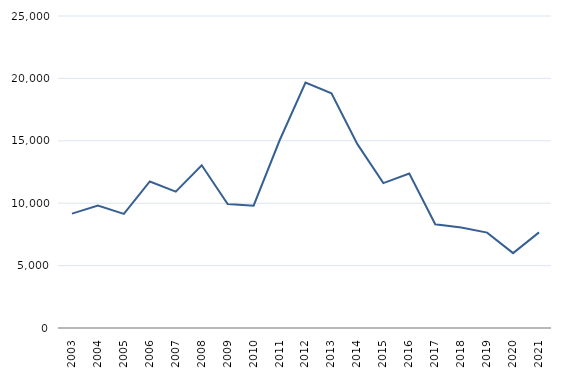
| Category | N |
|---|---|
| 2003.0 | 9165 |
| 2004.0 | 9807 |
| 2005.0 | 9146 |
| 2006.0 | 11742 |
| 2007.0 | 10930 |
| 2008.0 | 13044 |
| 2009.0 | 9933 |
| 2010.0 | 9801 |
| 2011.0 | 15023 |
| 2012.0 | 19658 |
| 2013.0 | 18803 |
| 2014.0 | 14732 |
| 2015.0 | 11607 |
| 2016.0 | 12377 |
| 2017.0 | 8314 |
| 2018.0 | 8047 |
| 2019.0 | 7643 |
| 2020.0 | 5998 |
| 2021.0 | 7663 |